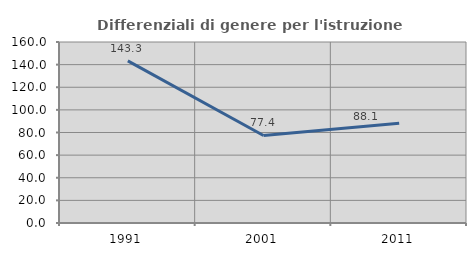
| Category | Differenziali di genere per l'istruzione superiore |
|---|---|
| 1991.0 | 143.299 |
| 2001.0 | 77.386 |
| 2011.0 | 88.095 |